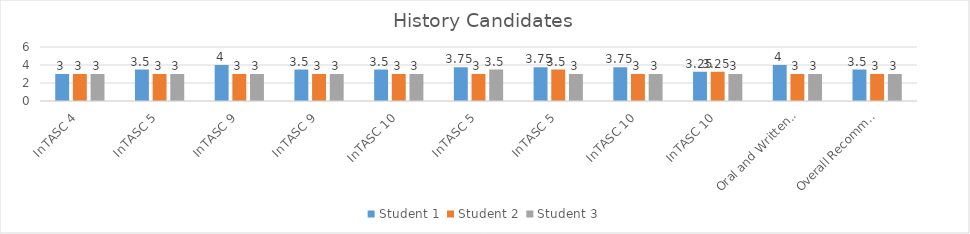
| Category | Student 1 | Student 2 | Student 3 |
|---|---|---|---|
| InTASC 4 | 3 | 3 | 3 |
| InTASC 5 | 3.5 | 3 | 3 |
| InTASC 9 | 4 | 3 | 3 |
| InTASC 9 | 3.5 | 3 | 3 |
| InTASC 10 | 3.5 | 3 | 3 |
| InTASC 5 | 3.75 | 3 | 3.5 |
| InTASC 5 | 3.75 | 3.5 | 3 |
| InTASC 10 | 3.75 | 3 | 3 |
| InTASC 10 | 3.25 | 3.25 | 3 |
| Oral and Written Communication | 4 | 3 | 3 |
| Overall Recommendation | 3.5 | 3 | 3 |